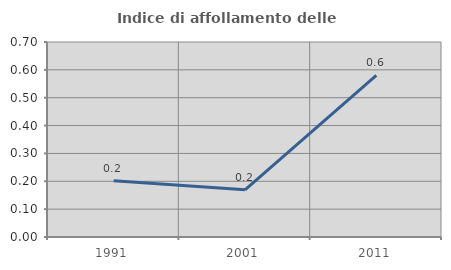
| Category | Indice di affollamento delle abitazioni  |
|---|---|
| 1991.0 | 0.202 |
| 2001.0 | 0.169 |
| 2011.0 | 0.58 |